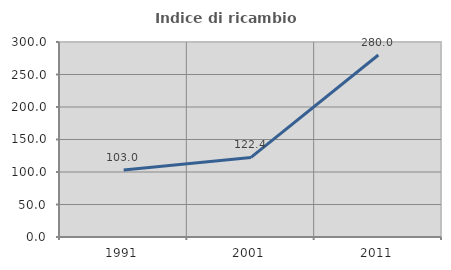
| Category | Indice di ricambio occupazionale  |
|---|---|
| 1991.0 | 102.985 |
| 2001.0 | 122.424 |
| 2011.0 | 280 |